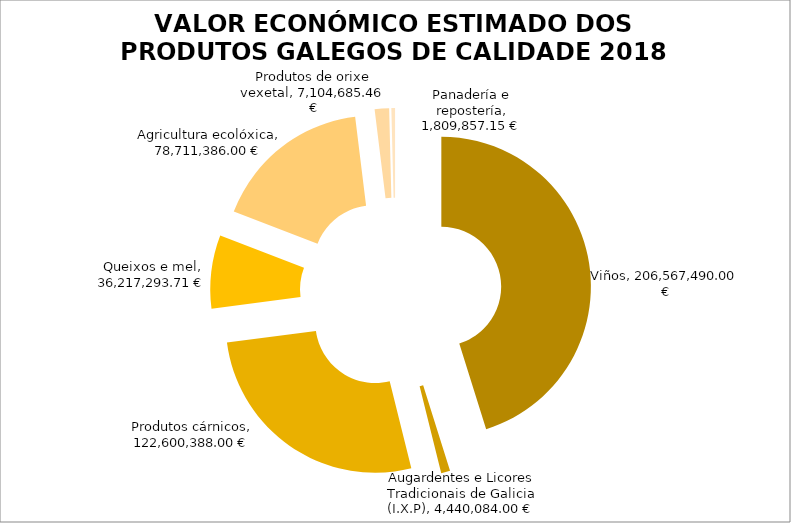
| Category | VALOR ECONÓMICO ESTIMADO DOS PRODUTOS GALEGOS DE CALIDADE 2018 |
|---|---|
| Viños | 206567490 |
| Augardentes e Licores Tradicionais de Galicia (I.X.P) | 4440084 |
| Produtos cárnicos | 122600388 |
| Queixos e mel | 36217293.71 |
| Agricultura ecolóxica | 78711386 |
| Produtos de orixe vexetal | 7104685.46 |
| Panadería e repostería | 1809857.15 |